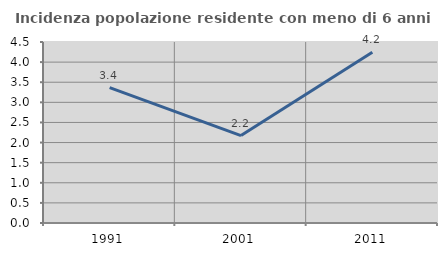
| Category | Incidenza popolazione residente con meno di 6 anni |
|---|---|
| 1991.0 | 3.365 |
| 2001.0 | 2.174 |
| 2011.0 | 4.245 |